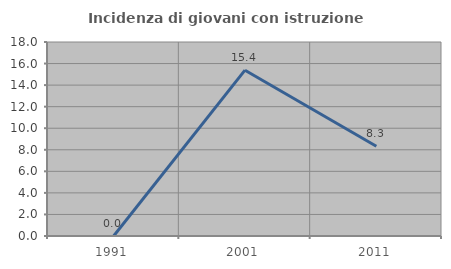
| Category | Incidenza di giovani con istruzione universitaria |
|---|---|
| 1991.0 | 0 |
| 2001.0 | 15.385 |
| 2011.0 | 8.333 |